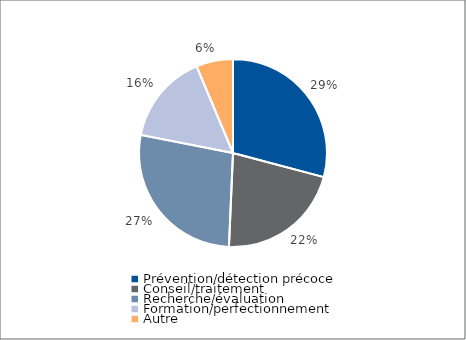
| Category | Series 0 |
|---|---|
| Prévention/détection précoce | 219917 |
| Conseil/traitement | 162778 |
| Recherche/évaluation | 206894 |
| Formation/perfectionnement | 117658 |
| Autre | 47754 |